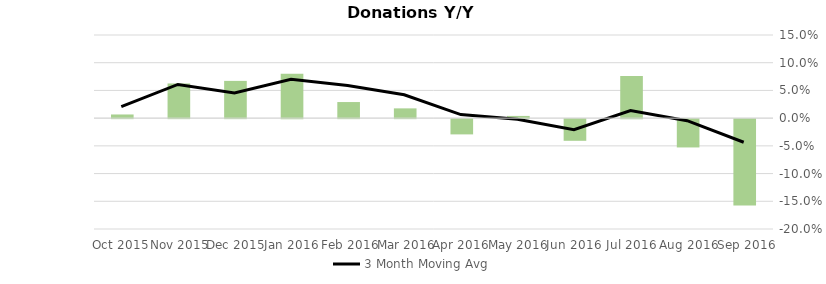
| Category | Donation Index Amount Y/Y Growth |
|---|---|
| Sep 2016 | -0.156 |
| Aug 2016 | -0.051 |
| Jul 2016 | 0.076 |
| Jun 2016 | -0.039 |
| May 2016 | 0.004 |
| Apr 2016 | -0.028 |
| Mar 2016 | 0.018 |
| Feb 2016 | 0.029 |
| Jan 2016 | 0.08 |
| Dec 2015 | 0.067 |
| Nov 2015 | 0.063 |
| Oct 2015 | 0.007 |